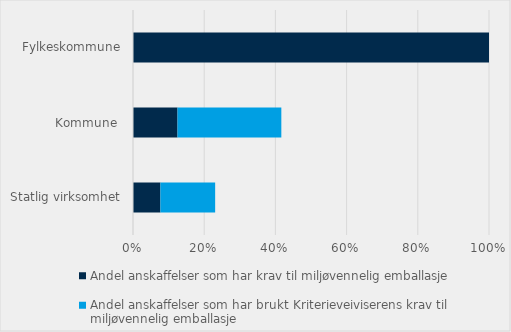
| Category | Andel anskaffelser som har krav til miljøvennelig emballasje | Andel anskaffelser som har brukt Kriterieveiviserens krav til miljøvennelig emballasje |
|---|---|---|
| Statlig virksomhet | 0.077 | 0.154 |
| Kommune  | 0.125 | 0.292 |
| Fylkeskommune | 1 | 0 |